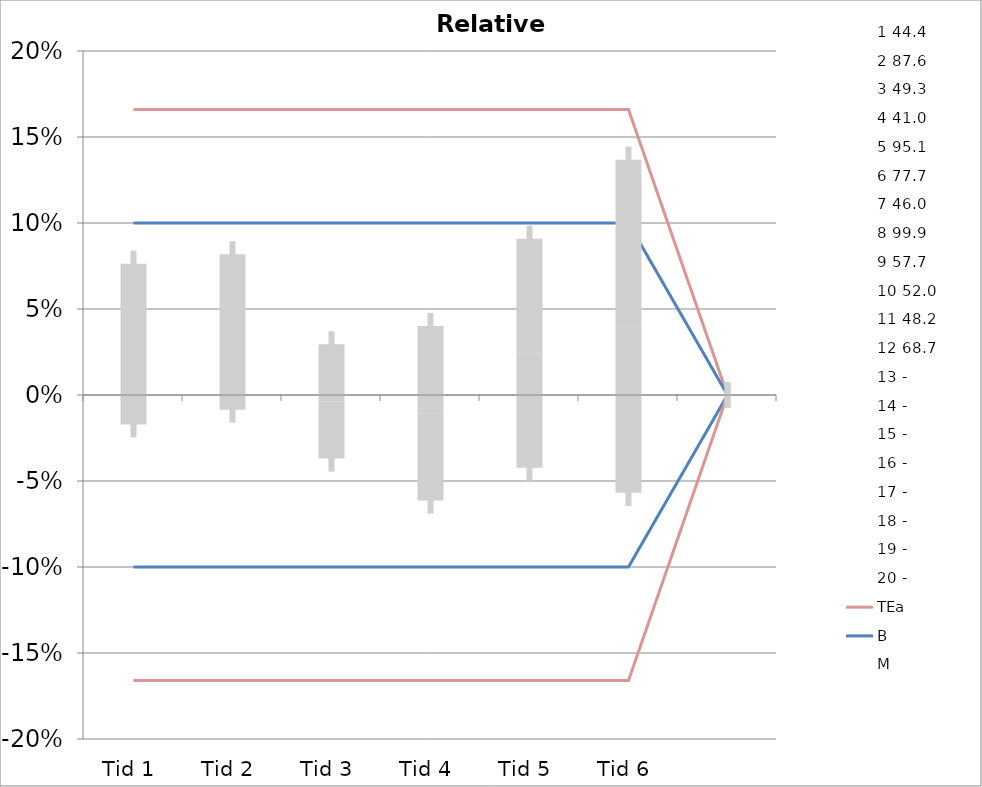
| Category | 1 | 2 | 3 | 4 | 5 | 6 | 7 | 8 | 9 | 10 | 11 | 12 | 13 | 14 | 15 | 16 | 17 | 18 | 19 | 20 | TEa | B | -B | -TEa | M |
|---|---|---|---|---|---|---|---|---|---|---|---|---|---|---|---|---|---|---|---|---|---|---|---|---|---|
| Tid 1 | 0.099 | -0.079 | 0.016 | -0.012 | -0.041 | 0 | -0.007 | -0.008 | 0.049 | 0.152 | 0.046 | 0.111 | 0 | 0 | 0 | 0 | 0 | 0 | 0 | 0 | 0.166 | 0.1 | -0.1 | -0.166 | 0.03 |
| Tid 2 | 0.088 | -0.018 | 0.132 | -0.032 | 0 | -0.028 | -0.041 | 0.046 | 0.05 | 0.06 | -0.004 | 0.151 | 0 | 0 | 0 | 0 | 0 | 0 | 0 | 0 | 0.166 | 0.1 | -0.1 | -0.166 | 0.037 |
| Tid 3 | 0.041 | 0 | -0.039 | 0.08 | 0 | -0.042 | -0.039 | 0.02 | -0.04 | 0.044 | -0.05 | -0.013 | 0 | 0 | 0 | 0 | 0 | 0 | 0 | 0 | 0.166 | 0.1 | -0.1 | -0.166 | -0.004 |
| Tid 4 | 0.07 | -0.04 | -0.032 | -0.122 | 0 | -0.126 | -0.043 | 0.003 | 0.035 | 0.073 | -0.035 | 0.102 | 0 | 0 | 0 | 0 | 0 | 0 | 0 | 0 | 0.166 | 0.1 | -0.1 | -0.166 | -0.011 |
| Tid 5 | 0.074 | 0.018 | 0.091 | 0.063 | 0 | -0.063 | 0 | 0 | 0 | -0.038 | 0 | 0 | 0 | 0 | 0 | 0 | 0 | 0 | 0 | 0 | 0.166 | 0.1 | -0.1 | -0.166 | 0.024 |
| Tid 6 | 0 | 0 | 0 | 0 | 0 | 0 | 0.128 | 0.063 | 0.08 | 0.042 | -0.139 | 0.066 | 0 | 0 | 0 | 0 | 0 | 0 | 0 | 0 | 0.166 | 0.1 | -0.1 | -0.166 | 0.04 |